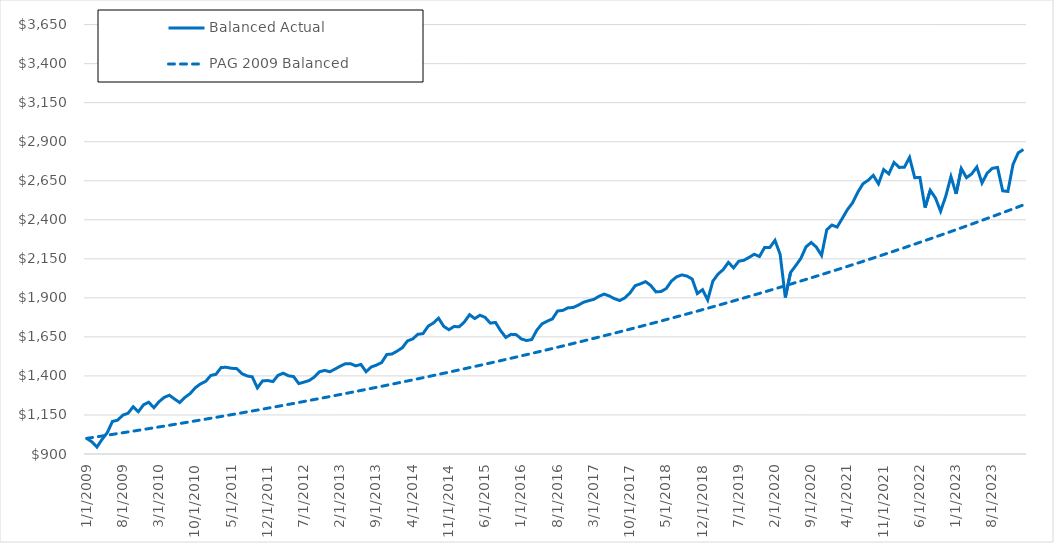
| Category | Balanced Actual | PAG 2009 Balanced |
|---|---|---|
| 1/1/09 | 1000 | 1000 |
| 2/1/09 | 978.422 | 1005.065 |
| 3/1/09 | 944.396 | 1010.155 |
| 4/1/09 | 994.067 | 1015.272 |
| 5/1/09 | 1036.85 | 1020.414 |
| 6/1/09 | 1108.603 | 1025.582 |
| 7/1/09 | 1116.56 | 1030.776 |
| 8/1/09 | 1149.031 | 1035.997 |
| 9/1/09 | 1160.659 | 1041.244 |
| 10/1/09 | 1202.584 | 1046.518 |
| 11/1/09 | 1170.788 | 1051.818 |
| 12/1/09 | 1215.014 | 1057.146 |
| 1/1/10 | 1231.971 | 1062.5 |
| 2/1/10 | 1196.403 | 1067.881 |
| 3/1/10 | 1235.203 | 1073.29 |
| 4/1/10 | 1262.739 | 1078.726 |
| 5/1/10 | 1276.399 | 1084.19 |
| 6/1/10 | 1251.861 | 1089.681 |
| 7/1/10 | 1229.159 | 1095.2 |
| 8/1/10 | 1262.458 | 1100.747 |
| 9/1/10 | 1286.913 | 1106.322 |
| 10/1/10 | 1324.046 | 1111.925 |
| 11/1/10 | 1348.661 | 1117.557 |
| 12/1/10 | 1364.893 | 1123.217 |
| 1/1/11 | 1403.073 | 1128.906 |
| 2/1/11 | 1410.486 | 1134.624 |
| 3/1/11 | 1454.216 | 1140.371 |
| 4/1/11 | 1455.194 | 1146.146 |
| 5/1/11 | 1448.744 | 1151.951 |
| 6/1/11 | 1447.094 | 1157.786 |
| 7/1/11 | 1414.514 | 1163.65 |
| 8/1/11 | 1400.064 | 1169.544 |
| 9/1/11 | 1394.339 | 1175.467 |
| 10/1/11 | 1323.311 | 1181.421 |
| 11/1/11 | 1368.312 | 1187.404 |
| 12/1/11 | 1370.465 | 1193.418 |
| 1/1/12 | 1363.603 | 1199.463 |
| 2/1/12 | 1404.152 | 1205.538 |
| 3/1/12 | 1417.368 | 1211.644 |
| 4/1/12 | 1400.745 | 1217.781 |
| 5/1/12 | 1395.959 | 1223.948 |
| 6/1/12 | 1350.929 | 1230.148 |
| 7/1/12 | 1360.309 | 1236.378 |
| 8/1/12 | 1370.499 | 1242.64 |
| 9/1/12 | 1392.842 | 1248.934 |
| 10/1/12 | 1426.652 | 1255.26 |
| 11/1/12 | 1435.48 | 1261.617 |
| 12/1/12 | 1426.763 | 1268.007 |
| 1/1/13 | 1443.908 | 1274.429 |
| 2/1/13 | 1462.513 | 1280.884 |
| 3/1/13 | 1478.156 | 1287.372 |
| 4/1/13 | 1478.568 | 1293.892 |
| 5/1/13 | 1464.492 | 1300.445 |
| 6/1/13 | 1473.577 | 1307.032 |
| 7/1/13 | 1427.101 | 1313.652 |
| 8/1/13 | 1457.502 | 1320.305 |
| 9/1/13 | 1469.272 | 1326.992 |
| 10/1/13 | 1485.433 | 1333.713 |
| 11/1/13 | 1537.118 | 1340.468 |
| 12/1/13 | 1540.572 | 1347.258 |
| 1/1/14 | 1558.956 | 1354.081 |
| 2/1/14 | 1580.712 | 1360.939 |
| 3/1/14 | 1624.233 | 1367.832 |
| 4/1/14 | 1636.798 | 1374.76 |
| 5/1/14 | 1666.519 | 1381.723 |
| 6/1/14 | 1671.025 | 1388.721 |
| 7/1/14 | 1718.828 | 1395.755 |
| 8/1/14 | 1739.064 | 1402.824 |
| 9/1/14 | 1769.933 | 1409.929 |
| 10/1/14 | 1717.458 | 1417.07 |
| 11/1/14 | 1696.052 | 1424.248 |
| 12/1/14 | 1716.673 | 1431.461 |
| 1/1/15 | 1714.572 | 1438.711 |
| 2/1/15 | 1746.398 | 1445.998 |
| 3/1/15 | 1792.225 | 1453.322 |
| 4/1/15 | 1767.505 | 1460.683 |
| 5/1/15 | 1788.717 | 1468.081 |
| 6/1/15 | 1774.944 | 1475.516 |
| 7/1/15 | 1738.165 | 1482.99 |
| 8/1/15 | 1742.537 | 1490.501 |
| 9/1/15 | 1689.498 | 1498.05 |
| 10/1/15 | 1646.65 | 1505.637 |
| 11/1/15 | 1666.387 | 1513.263 |
| 12/1/15 | 1664.412 | 1520.927 |
| 1/1/16 | 1637.024 | 1528.631 |
| 2/1/16 | 1626.756 | 1536.373 |
| 3/1/16 | 1632.919 | 1544.154 |
| 4/1/16 | 1693.439 | 1551.975 |
| 5/1/16 | 1734.035 | 1559.836 |
| 6/1/16 | 1750.805 | 1567.736 |
| 7/1/16 | 1765.12 | 1575.676 |
| 8/1/16 | 1815.937 | 1583.657 |
| 9/1/16 | 1819.735 | 1591.678 |
| 10/1/16 | 1836.118 | 1599.74 |
| 11/1/16 | 1838.326 | 1607.842 |
| 12/1/16 | 1853.37 | 1615.985 |
| 1/1/17 | 1871.633 | 1624.17 |
| 2/1/17 | 1881.903 | 1632.396 |
| 3/1/17 | 1890.189 | 1640.664 |
| 4/1/17 | 1910.029 | 1648.974 |
| 5/1/17 | 1924.253 | 1657.326 |
| 6/1/17 | 1911.718 | 1665.72 |
| 7/1/17 | 1894.818 | 1674.156 |
| 8/1/17 | 1882.76 | 1682.636 |
| 9/1/17 | 1899.634 | 1691.158 |
| 10/1/17 | 1931.932 | 1699.723 |
| 11/1/17 | 1978.377 | 1708.332 |
| 12/1/17 | 1989.578 | 1716.984 |
| 1/1/18 | 2003.802 | 1725.681 |
| 2/1/18 | 1979.381 | 1734.421 |
| 3/1/18 | 1938.302 | 1743.206 |
| 4/1/18 | 1940.622 | 1752.035 |
| 5/1/18 | 1960.068 | 1760.908 |
| 6/1/18 | 2007.529 | 1769.827 |
| 7/1/18 | 2034.875 | 1778.791 |
| 8/1/18 | 2047.027 | 1787.8 |
| 9/1/18 | 2039.548 | 1796.855 |
| 10/1/18 | 2020.944 | 1805.956 |
| 11/1/18 | 1927.599 | 1815.103 |
| 12/1/18 | 1952.181 | 1824.296 |
| 1/1/19 | 1886.792 | 1833.536 |
| 2/1/19 | 2007.11 | 1842.822 |
| 3/1/19 | 2052.219 | 1852.156 |
| 4/1/19 | 2081.196 | 1861.537 |
| 5/1/19 | 2127.458 | 1870.965 |
| 6/1/19 | 2091.966 | 1880.441 |
| 7/1/19 | 2134.55 | 1889.965 |
| 8/1/19 | 2140.752 | 1899.538 |
| 9/1/19 | 2159.297 | 1909.159 |
| 10/1/19 | 2179.224 | 1918.828 |
| 11/1/19 | 2164.943 | 1928.547 |
| 12/1/19 | 2222.772 | 1938.315 |
| 1/1/20 | 2222.169 | 1948.132 |
| 2/1/20 | 2268.409 | 1957.999 |
| 3/1/20 | 2178.265 | 1967.916 |
| 4/1/20 | 1902.185 | 1977.883 |
| 5/1/20 | 2061.733 | 1987.9 |
| 6/1/20 | 2105.926 | 1997.969 |
| 7/1/20 | 2152.547 | 2008.088 |
| 8/1/20 | 2226.829 | 2018.259 |
| 9/1/20 | 2254.776 | 2028.481 |
| 10/1/20 | 2224.743 | 2038.755 |
| 11/1/20 | 2171.827 | 2049.081 |
| 12/1/20 | 2335.62 | 2059.459 |
| 1/1/21 | 2366.42 | 2069.89 |
| 2/1/21 | 2353.305 | 2080.374 |
| 3/1/21 | 2408.447 | 2090.91 |
| 4/1/21 | 2465.538 | 2101.501 |
| 5/1/21 | 2508.992 | 2112.144 |
| 6/1/21 | 2576.713 | 2122.842 |
| 7/1/21 | 2630.489 | 2133.594 |
| 8/1/21 | 2653.149 | 2144.4 |
| 9/1/21 | 2684.5 | 2155.261 |
| 10/1/21 | 2630.425 | 2166.177 |
| 11/1/21 | 2721.633 | 2177.148 |
| 12/1/21 | 2694.035 | 2188.175 |
| 1/1/22 | 2767.133 | 2199.258 |
| 2/1/22 | 2735.399 | 2210.397 |
| 3/1/22 | 2736.525 | 2221.592 |
| 4/1/22 | 2799.349 | 2232.844 |
| 5/1/22 | 2669.828 | 2244.153 |
| 6/1/22 | 2670.585 | 2255.52 |
| 7/1/22 | 2477.957 | 2266.943 |
| 8/1/22 | 2588.837 | 2278.425 |
| 9/1/22 | 2540.19 | 2289.965 |
| 10/1/22 | 2454.573 | 2301.563 |
| 11/1/22 | 2551.837 | 2313.22 |
| 12/1/22 | 2676.975 | 2324.936 |
| 1/1/23 | 2565.763 | 2336.712 |
| 2/1/23 | 2728.287 | 2348.547 |
| 3/1/23 | 2669.836 | 2360.442 |
| 4/1/23 | 2693.665 | 2372.397 |
| 5/1/23 | 2738.091 | 2384.413 |
| 6/1/23 | 2635.615 | 2396.49 |
| 7/1/23 | 2698.857 | 2408.627 |
| 8/1/23 | 2729.88 | 2420.827 |
| 9/1/23 | 2735.428 | 2433.088 |
| 10/1/23 | 2585.46 | 2445.411 |
| 11/1/23 | 2581.723 | 2457.797 |
| 12/1/23 | 2755.564 | 2470.245 |
| 1/1/24 | 2828.736 | 2482.756 |
| 2/1/24 | 2850.382 | 2495.331 |